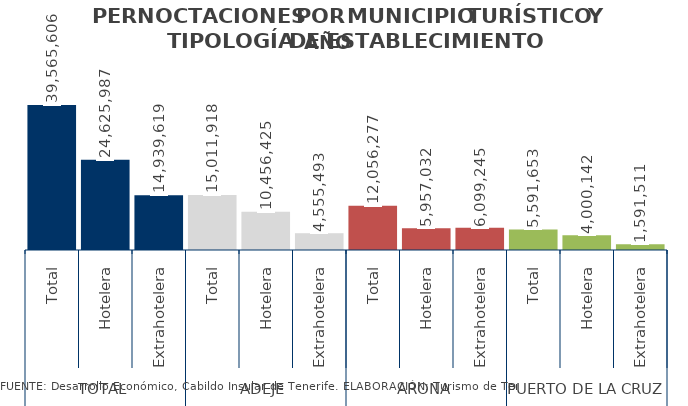
| Category | AÑO 2014 |
|---|---|
| 0 | 39565606 |
| 1 | 24625987 |
| 2 | 14939619 |
| 3 | 15011918 |
| 4 | 10456425 |
| 5 | 4555493 |
| 6 | 12056277 |
| 7 | 5957032 |
| 8 | 6099245 |
| 9 | 5591653 |
| 10 | 4000142 |
| 11 | 1591511 |